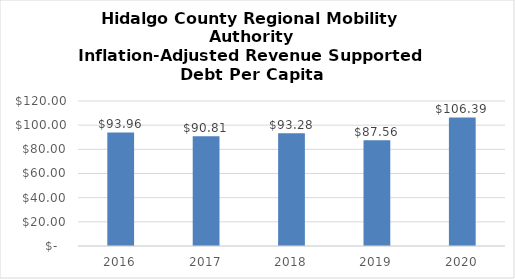
| Category | Series 0 |
|---|---|
| 2016.0 | 93.961 |
| 2017.0 | 90.81 |
| 2018.0 | 93.28 |
| 2019.0 | 87.557 |
| 2020.0 | 106.393 |